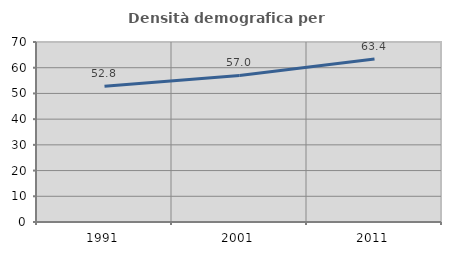
| Category | Densità demografica |
|---|---|
| 1991.0 | 52.795 |
| 2001.0 | 56.992 |
| 2011.0 | 63.37 |